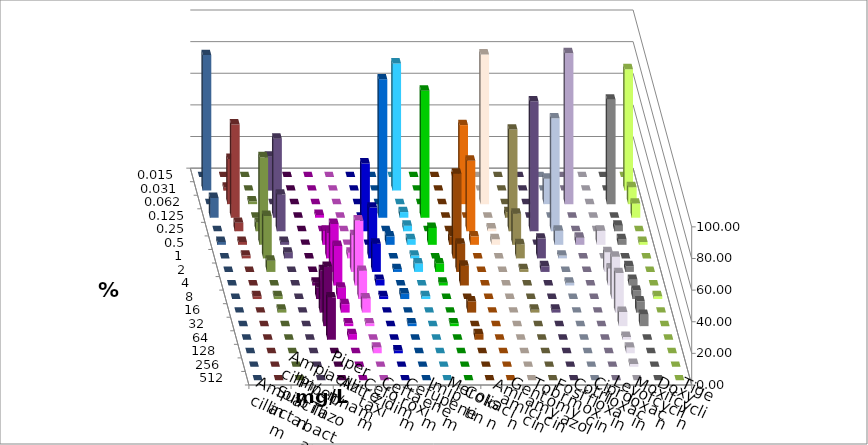
| Category | Ampicillin | Ampicillin/ Sulbactam | Piperacillin | Piperacillin/ Tazobactam | Aztreonam | Cefotaxim | Ceftazidim | Cefuroxim | Imipenem | Meropenem | Colistin | Amikacin | Gentamicin | Tobramycin | Fosfomycin | Cotrimoxazol | Ciprofloxacin | Levofloxacin | Moxifloxacin | Doxycyclin | Tigecyclin |
|---|---|---|---|---|---|---|---|---|---|---|---|---|---|---|---|---|---|---|---|---|---|
| 0.015 | 0 | 0 | 0 | 0 | 0 | 0 | 0 | 0 | 0 | 0 | 0 | 0 | 0 | 0 | 0 | 0 | 0 | 0 | 0 | 0 | 0 |
| 0.031 | 0 | 0 | 0 | 0 | 0 | 80.357 | 0 | 0 | 0 | 0 | 0 | 0 | 0 | 0 | 0 | 0 | 76.786 | 85.714 | 1.786 | 0 | 21.429 |
| 0.062 | 0 | 0 | 0 | 0 | 0 | 0 | 0 | 0 | 50 | 94.643 | 0 | 0 | 16.071 | 95.455 | 0 | 66.071 | 10.714 | 0 | 28.571 | 1.786 | 0 |
| 0.125 | 0 | 1.786 | 0 | 0 | 87.5 | 3.571 | 80.357 | 0 | 0 | 0 | 3.571 | 0 | 0 | 0 | 0 | 0 | 8.929 | 12.5 | 58.929 | 0 | 50 |
| 0.25 | 0 | 0 | 0 | 42.857 | 0 | 3.571 | 0 | 0 | 44.643 | 1.786 | 64.286 | 82.143 | 71.429 | 0 | 0 | 3.571 | 0 | 0 | 5.357 | 5.357 | 23.214 |
| 0.5 | 0 | 8.929 | 0 | 0 | 5.357 | 3.571 | 10.714 | 5.357 | 5.357 | 3.571 | 19.643 | 0 | 8.929 | 4.545 | 8.929 | 3.571 | 1.786 | 1.786 | 1.786 | 55.357 | 1.786 |
| 1.0 | 0 | 16.071 | 3.571 | 32.143 | 0 | 1.786 | 0 | 53.571 | 0 | 0 | 8.929 | 12.5 | 1.786 | 0 | 0 | 0 | 0 | 0 | 1.786 | 26.786 | 3.571 |
| 2.0 | 0 | 30.357 | 23.214 | 17.857 | 1.786 | 5.357 | 5.357 | 17.857 | 0 | 0 | 1.786 | 3.571 | 0 | 0 | 12.5 | 3.571 | 0 | 0 | 0 | 7.143 | 0 |
| 4.0 | 1.786 | 25 | 41.071 | 3.571 | 0 | 0 | 1.786 | 12.5 | 0 | 0 | 0 | 0 | 1.786 | 0 | 10.714 | 3.571 | 0 | 0 | 0 | 0 | 0 |
| 8.0 | 7.143 | 7.143 | 17.857 | 1.786 | 3.571 | 1.786 | 0 | 0 | 0 | 0 | 0 | 0 | 0 | 0 | 26.786 | 5.357 | 1.786 | 0 | 1.786 | 1.786 | 0 |
| 16.0 | 26.786 | 5.357 | 8.929 | 0 | 0 | 0 | 0 | 7.143 | 0 | 0 | 1.786 | 1.786 | 0 | 0 | 25 | 7.143 | 0 | 0 | 0 | 1.786 | 0 |
| 32.0 | 37.5 | 1.786 | 1.786 | 0 | 1.786 | 0 | 1.786 | 0 | 0 | 0 | 0 | 0 | 0 | 0 | 8.929 | 7.143 | 0 | 0 | 0 | 0 | 0 |
| 64.0 | 26.786 | 3.571 | 0 | 0 | 0 | 0 | 0 | 3.571 | 0 | 0 | 0 | 0 | 0 | 0 | 1.786 | 0 | 0 | 0 | 0 | 0 | 0 |
| 128.0 | 0 | 0 | 3.571 | 1.786 | 0 | 0 | 0 | 0 | 0 | 0 | 0 | 0 | 0 | 0 | 3.571 | 0 | 0 | 0 | 0 | 0 | 0 |
| 256.0 | 0 | 0 | 0 | 0 | 0 | 0 | 0 | 0 | 0 | 0 | 0 | 0 | 0 | 0 | 1.786 | 0 | 0 | 0 | 0 | 0 | 0 |
| 512.0 | 0 | 0 | 0 | 0 | 0 | 0 | 0 | 0 | 0 | 0 | 0 | 0 | 0 | 0 | 0 | 0 | 0 | 0 | 0 | 0 | 0 |